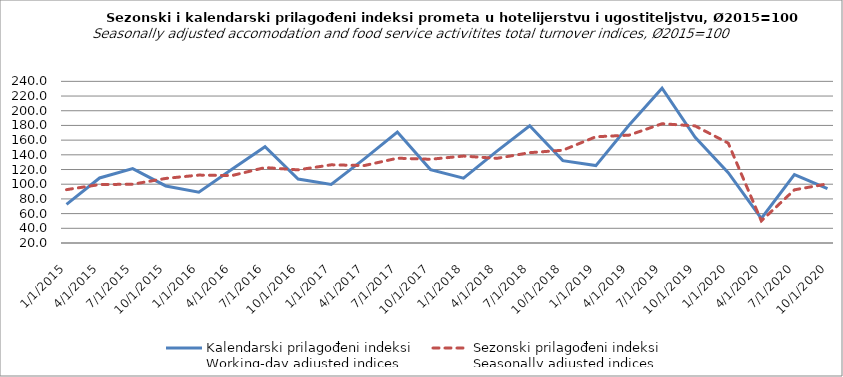
| Category | Kalendarski prilagođeni indeksi
Working-day adjusted indices | Sezonski prilagođeni indeksi
Seasonally adjusted indices |
|---|---|---|
| 1/1/15 | 72.654 | 92.589 |
| 4/1/15 | 108.498 | 99.542 |
| 7/1/15 | 121.199 | 99.995 |
| 10/1/15 | 97.649 | 107.875 |
| 1/1/16 | 89.257 | 112.417 |
| 4/1/16 | 120.357 | 111.795 |
| 7/1/16 | 150.984 | 122.661 |
| 10/1/16 | 107.093 | 119.541 |
| 1/1/17 | 99.614 | 126.384 |
| 4/1/17 | 134.529 | 125.389 |
| 7/1/17 | 171.022 | 135.401 |
| 10/1/17 | 119.879 | 133.97 |
| 1/1/18 | 108.348 | 138.308 |
| 4/1/18 | 144.684 | 135.17 |
| 7/1/18 | 179.488 | 142.924 |
| 10/1/18 | 132.076 | 146.269 |
| 1/1/19 | 125.342 | 164.587 |
| 4/1/19 | 180.192 | 166.752 |
| 7/1/19 | 230.564 | 182.295 |
| 10/1/19 | 163.885 | 179.331 |
| 1/1/20 | 115.775 | 155.939 |
| 4/1/20 | 53.437 | 50.088 |
| 7/1/20 | 113.183 | 92.351 |
| 10/1/20 | 93.954 | 100.512 |